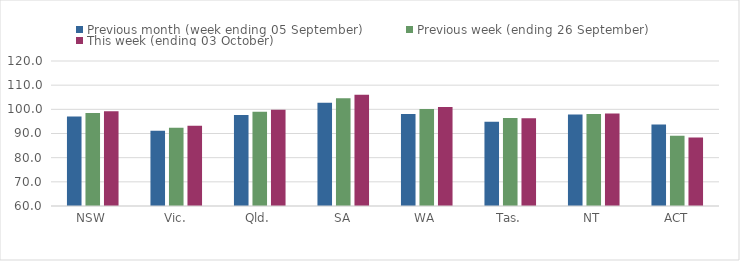
| Category | Previous month (week ending 05 September) | Previous week (ending 26 September) | This week (ending 03 October) |
|---|---|---|---|
| NSW | 97 | 98.45 | 99.19 |
| Vic. | 91.11 | 92.35 | 93.25 |
| Qld. | 97.69 | 98.98 | 99.81 |
| SA | 102.71 | 104.62 | 105.99 |
| WA | 98.11 | 100.09 | 100.93 |
| Tas. | 94.82 | 96.45 | 96.33 |
| NT | 97.9 | 98.03 | 98.25 |
| ACT | 93.69 | 89.02 | 88.33 |